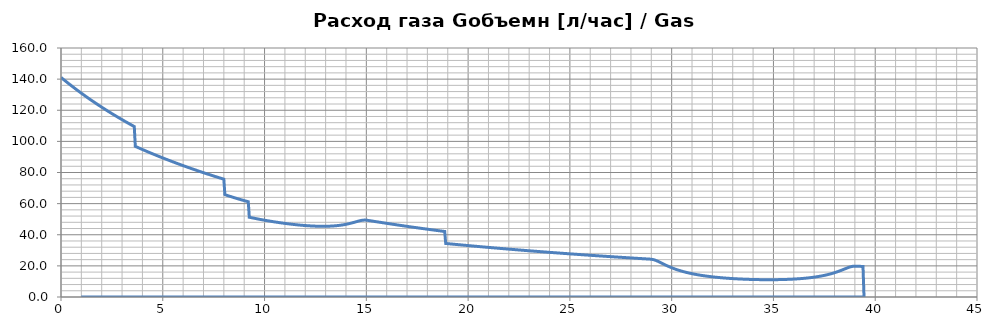
| Category | Расход газа Gобъемн [л/час] / Gas consumption [l/s] |
|---|---|
| 0.0 | 141.093 |
| 0.05 | 140.556 |
| 0.1 | 140.022 |
| 0.15000000000000002 | 139.491 |
| 0.2 | 138.964 |
| 0.25 | 138.441 |
| 0.3 | 137.92 |
| 0.35 | 137.403 |
| 0.39999999999999997 | 136.889 |
| 0.44999999999999996 | 136.378 |
| 0.49999999999999994 | 135.87 |
| 0.5499999999999999 | 135.366 |
| 0.6 | 134.864 |
| 0.65 | 134.366 |
| 0.7000000000000001 | 133.871 |
| 0.7500000000000001 | 133.378 |
| 0.8000000000000002 | 132.889 |
| 0.8500000000000002 | 132.403 |
| 0.9000000000000002 | 131.919 |
| 0.9500000000000003 | 131.439 |
| 1.0000000000000002 | 130.961 |
| 1.0500000000000003 | 130.486 |
| 1.1000000000000003 | 130.014 |
| 1.1500000000000004 | 129.545 |
| 1.2000000000000004 | 129.078 |
| 1.2500000000000004 | 128.615 |
| 1.3000000000000005 | 128.154 |
| 1.3500000000000005 | 127.695 |
| 1.4000000000000006 | 127.24 |
| 1.4500000000000006 | 126.787 |
| 1.5000000000000007 | 126.337 |
| 1.5500000000000007 | 125.889 |
| 1.6000000000000008 | 125.444 |
| 1.6500000000000008 | 125.001 |
| 1.7000000000000008 | 124.561 |
| 1.7500000000000009 | 124.124 |
| 1.800000000000001 | 123.689 |
| 1.850000000000001 | 123.257 |
| 1.900000000000001 | 122.827 |
| 1.950000000000001 | 122.399 |
| 2.000000000000001 | 121.973 |
| 2.0500000000000007 | 121.551 |
| 2.1000000000000005 | 121.13 |
| 2.1500000000000004 | 120.712 |
| 2.2 | 120.297 |
| 2.25 | 119.883 |
| 2.3 | 119.472 |
| 2.3499999999999996 | 119.063 |
| 2.3999999999999995 | 118.657 |
| 2.4499999999999993 | 118.253 |
| 2.499999999999999 | 117.851 |
| 2.549999999999999 | 117.451 |
| 2.5999999999999988 | 117.053 |
| 2.6499999999999986 | 116.658 |
| 2.6999999999999984 | 116.264 |
| 2.7499999999999982 | 115.873 |
| 2.799999999999998 | 115.484 |
| 2.849999999999998 | 115.097 |
| 2.8999999999999977 | 114.712 |
| 2.9499999999999975 | 114.33 |
| 2.9999999999999973 | 113.949 |
| 3.049999999999997 | 113.571 |
| 3.099999999999997 | 113.194 |
| 3.149999999999997 | 112.819 |
| 3.1999999999999966 | 112.447 |
| 3.2499999999999964 | 112.076 |
| 3.2999999999999963 | 111.707 |
| 3.349999999999996 | 111.34 |
| 3.399999999999996 | 110.976 |
| 3.4499999999999957 | 110.613 |
| 3.4999999999999956 | 110.252 |
| 3.5499999999999954 | 109.892 |
| 3.599999999999995 | 109.535 |
| 3.649999999999995 | 96.794 |
| 3.699999999999995 | 96.502 |
| 3.7499999999999947 | 96.211 |
| 3.7999999999999945 | 95.921 |
| 3.8499999999999943 | 95.633 |
| 3.899999999999994 | 95.347 |
| 3.949999999999994 | 95.061 |
| 3.999999999999994 | 94.777 |
| 4.049999999999994 | 94.494 |
| 4.099999999999993 | 94.213 |
| 4.149999999999993 | 93.933 |
| 4.199999999999993 | 93.654 |
| 4.249999999999993 | 93.377 |
| 4.299999999999993 | 93.1 |
| 4.3499999999999925 | 92.826 |
| 4.399999999999992 | 92.552 |
| 4.449999999999992 | 92.279 |
| 4.499999999999992 | 92.008 |
| 4.549999999999992 | 91.738 |
| 4.599999999999992 | 91.47 |
| 4.6499999999999915 | 91.202 |
| 4.699999999999991 | 90.936 |
| 4.749999999999991 | 90.671 |
| 4.799999999999991 | 90.407 |
| 4.849999999999991 | 90.145 |
| 4.899999999999991 | 89.883 |
| 4.94999999999999 | 89.623 |
| 4.99999999999999 | 89.364 |
| 5.04999999999999 | 89.106 |
| 5.09999999999999 | 88.849 |
| 5.14999999999999 | 88.593 |
| 5.1999999999999895 | 88.339 |
| 5.249999999999989 | 88.085 |
| 5.299999999999989 | 87.833 |
| 5.349999999999989 | 87.582 |
| 5.399999999999989 | 87.332 |
| 5.449999999999989 | 87.083 |
| 5.4999999999999885 | 86.835 |
| 5.549999999999988 | 86.589 |
| 5.599999999999988 | 86.343 |
| 5.649999999999988 | 86.099 |
| 5.699999999999988 | 85.855 |
| 5.749999999999988 | 85.613 |
| 5.799999999999987 | 85.371 |
| 5.849999999999987 | 85.131 |
| 5.899999999999987 | 84.892 |
| 5.949999999999987 | 84.653 |
| 5.999999999999987 | 84.416 |
| 6.0499999999999865 | 84.18 |
| 6.099999999999986 | 83.945 |
| 6.149999999999986 | 83.711 |
| 6.199999999999986 | 83.478 |
| 6.249999999999986 | 83.245 |
| 6.299999999999986 | 83.014 |
| 6.349999999999985 | 82.784 |
| 6.399999999999985 | 82.555 |
| 6.449999999999985 | 82.327 |
| 6.499999999999985 | 82.099 |
| 6.549999999999985 | 81.873 |
| 6.5999999999999845 | 81.648 |
| 6.649999999999984 | 81.423 |
| 6.699999999999984 | 81.2 |
| 6.749999999999984 | 80.977 |
| 6.799999999999984 | 80.756 |
| 6.849999999999984 | 80.535 |
| 6.8999999999999835 | 80.316 |
| 6.949999999999983 | 80.097 |
| 6.999999999999983 | 79.879 |
| 7.049999999999983 | 79.662 |
| 7.099999999999983 | 79.446 |
| 7.149999999999983 | 79.231 |
| 7.199999999999982 | 79.016 |
| 7.249999999999982 | 78.803 |
| 7.299999999999982 | 78.59 |
| 7.349999999999982 | 78.379 |
| 7.399999999999982 | 78.168 |
| 7.4499999999999815 | 77.958 |
| 7.499999999999981 | 77.749 |
| 7.549999999999981 | 77.541 |
| 7.599999999999981 | 77.333 |
| 7.649999999999981 | 77.127 |
| 7.699999999999981 | 76.921 |
| 7.7499999999999805 | 76.716 |
| 7.79999999999998 | 76.512 |
| 7.84999999999998 | 76.309 |
| 7.89999999999998 | 76.107 |
| 7.94999999999998 | 75.905 |
| 7.99999999999998 | 75.705 |
| 8.04999999999998 | 65.791 |
| 8.09999999999998 | 65.566 |
| 8.14999999999998 | 65.344 |
| 8.199999999999982 | 65.125 |
| 8.249999999999982 | 64.908 |
| 8.299999999999983 | 64.694 |
| 8.349999999999984 | 64.482 |
| 8.399999999999984 | 64.272 |
| 8.449999999999985 | 64.065 |
| 8.499999999999986 | 63.861 |
| 8.549999999999986 | 63.658 |
| 8.599999999999987 | 63.458 |
| 8.649999999999988 | 63.26 |
| 8.699999999999989 | 63.064 |
| 8.74999999999999 | 62.87 |
| 8.79999999999999 | 62.679 |
| 8.84999999999999 | 62.489 |
| 8.899999999999991 | 62.302 |
| 8.949999999999992 | 62.116 |
| 8.999999999999993 | 61.932 |
| 9.049999999999994 | 61.75 |
| 9.099999999999994 | 61.571 |
| 9.149999999999995 | 61.393 |
| 9.199999999999996 | 61.216 |
| 9.249999999999996 | 51.247 |
| 9.299999999999997 | 51.108 |
| 9.349999999999998 | 50.972 |
| 9.399999999999999 | 50.837 |
| 9.45 | 50.704 |
| 9.5 | 50.572 |
| 9.55 | 50.441 |
| 9.600000000000001 | 50.313 |
| 9.650000000000002 | 50.185 |
| 9.700000000000003 | 50.06 |
| 9.750000000000004 | 49.935 |
| 9.800000000000004 | 49.813 |
| 9.850000000000005 | 49.691 |
| 9.900000000000006 | 49.571 |
| 9.950000000000006 | 49.453 |
| 10.000000000000007 | 49.336 |
| 10.050000000000008 | 49.221 |
| 10.100000000000009 | 49.107 |
| 10.15000000000001 | 48.994 |
| 10.20000000000001 | 48.883 |
| 10.25000000000001 | 48.773 |
| 10.300000000000011 | 48.665 |
| 10.350000000000012 | 48.558 |
| 10.400000000000013 | 48.453 |
| 10.450000000000014 | 48.349 |
| 10.500000000000014 | 48.246 |
| 10.550000000000015 | 48.145 |
| 10.600000000000016 | 48.046 |
| 10.650000000000016 | 47.948 |
| 10.700000000000017 | 47.851 |
| 10.750000000000018 | 47.756 |
| 10.800000000000018 | 47.662 |
| 10.85000000000002 | 47.57 |
| 10.90000000000002 | 47.479 |
| 10.95000000000002 | 47.39 |
| 11.000000000000021 | 47.303 |
| 11.050000000000022 | 47.217 |
| 11.100000000000023 | 47.133 |
| 11.150000000000023 | 47.05 |
| 11.200000000000024 | 46.969 |
| 11.250000000000025 | 46.889 |
| 11.300000000000026 | 46.811 |
| 11.350000000000026 | 46.735 |
| 11.400000000000027 | 46.661 |
| 11.450000000000028 | 46.588 |
| 11.500000000000028 | 46.517 |
| 11.55000000000003 | 46.448 |
| 11.60000000000003 | 46.38 |
| 11.65000000000003 | 46.315 |
| 11.700000000000031 | 46.251 |
| 11.750000000000032 | 46.19 |
| 11.800000000000033 | 46.13 |
| 11.850000000000033 | 46.073 |
| 11.900000000000034 | 46.017 |
| 11.950000000000035 | 45.964 |
| 12.000000000000036 | 45.913 |
| 12.050000000000036 | 45.864 |
| 12.100000000000037 | 45.817 |
| 12.150000000000038 | 45.773 |
| 12.200000000000038 | 45.731 |
| 12.250000000000039 | 45.691 |
| 12.30000000000004 | 45.654 |
| 12.35000000000004 | 45.62 |
| 12.400000000000041 | 45.588 |
| 12.450000000000042 | 45.559 |
| 12.500000000000043 | 45.533 |
| 12.550000000000043 | 45.51 |
| 12.600000000000044 | 45.49 |
| 12.650000000000045 | 45.473 |
| 12.700000000000045 | 45.459 |
| 12.750000000000046 | 45.449 |
| 12.800000000000047 | 45.442 |
| 12.850000000000048 | 45.438 |
| 12.900000000000048 | 45.439 |
| 12.950000000000049 | 45.443 |
| 13.00000000000005 | 45.451 |
| 13.05000000000005 | 45.463 |
| 13.100000000000051 | 45.479 |
| 13.150000000000052 | 45.5 |
| 13.200000000000053 | 45.526 |
| 13.250000000000053 | 45.556 |
| 13.300000000000054 | 45.591 |
| 13.350000000000055 | 45.631 |
| 13.400000000000055 | 45.676 |
| 13.450000000000056 | 45.727 |
| 13.500000000000057 | 45.784 |
| 13.550000000000058 | 45.847 |
| 13.600000000000058 | 45.915 |
| 13.650000000000059 | 45.991 |
| 13.70000000000006 | 46.072 |
| 13.75000000000006 | 46.161 |
| 13.800000000000061 | 46.256 |
| 13.850000000000062 | 46.359 |
| 13.900000000000063 | 46.469 |
| 13.950000000000063 | 46.587 |
| 14.000000000000064 | 46.712 |
| 14.050000000000065 | 46.845 |
| 14.100000000000065 | 46.986 |
| 14.150000000000066 | 47.134 |
| 14.200000000000067 | 47.29 |
| 14.250000000000068 | 47.453 |
| 14.300000000000068 | 47.623 |
| 14.350000000000069 | 47.799 |
| 14.40000000000007 | 47.979 |
| 14.45000000000007 | 48.163 |
| 14.500000000000071 | 48.349 |
| 14.550000000000072 | 48.534 |
| 14.600000000000072 | 48.714 |
| 14.650000000000073 | 48.886 |
| 14.700000000000074 | 49.045 |
| 14.750000000000075 | 49.185 |
| 14.800000000000075 | 49.299 |
| 14.850000000000076 | 49.379 |
| 14.900000000000077 | 49.42 |
| 14.950000000000077 | 49.416 |
| 15.000000000000078 | 49.369 |
| 15.050000000000079 | 49.288 |
| 15.10000000000008 | 49.189 |
| 15.15000000000008 | 49.083 |
| 15.200000000000081 | 48.978 |
| 15.250000000000082 | 48.873 |
| 15.300000000000082 | 48.769 |
| 15.350000000000083 | 48.665 |
| 15.400000000000084 | 48.561 |
| 15.450000000000085 | 48.457 |
| 15.500000000000085 | 48.354 |
| 15.550000000000086 | 48.251 |
| 15.600000000000087 | 48.148 |
| 15.650000000000087 | 48.046 |
| 15.700000000000088 | 47.944 |
| 15.750000000000089 | 47.842 |
| 15.80000000000009 | 47.741 |
| 15.85000000000009 | 47.64 |
| 15.900000000000091 | 47.539 |
| 15.950000000000092 | 47.439 |
| 16.000000000000092 | 47.338 |
| 16.050000000000093 | 47.239 |
| 16.100000000000094 | 47.139 |
| 16.150000000000095 | 47.04 |
| 16.200000000000095 | 46.941 |
| 16.250000000000096 | 46.842 |
| 16.300000000000097 | 46.744 |
| 16.350000000000097 | 46.646 |
| 16.400000000000098 | 46.548 |
| 16.4500000000001 | 46.451 |
| 16.5000000000001 | 46.354 |
| 16.5500000000001 | 46.257 |
| 16.6000000000001 | 46.16 |
| 16.6500000000001 | 46.064 |
| 16.700000000000102 | 45.968 |
| 16.750000000000103 | 45.872 |
| 16.800000000000104 | 45.777 |
| 16.850000000000104 | 45.682 |
| 16.900000000000105 | 45.587 |
| 16.950000000000106 | 45.492 |
| 17.000000000000107 | 45.398 |
| 17.050000000000107 | 45.304 |
| 17.100000000000108 | 45.21 |
| 17.15000000000011 | 45.117 |
| 17.20000000000011 | 45.024 |
| 17.25000000000011 | 44.931 |
| 17.30000000000011 | 44.838 |
| 17.35000000000011 | 44.746 |
| 17.400000000000112 | 44.654 |
| 17.450000000000113 | 44.562 |
| 17.500000000000114 | 44.47 |
| 17.550000000000114 | 44.379 |
| 17.600000000000115 | 44.288 |
| 17.650000000000116 | 44.197 |
| 17.700000000000117 | 44.107 |
| 17.750000000000117 | 44.017 |
| 17.800000000000118 | 43.927 |
| 17.85000000000012 | 43.837 |
| 17.90000000000012 | 43.748 |
| 17.95000000000012 | 43.659 |
| 18.00000000000012 | 43.57 |
| 18.05000000000012 | 43.481 |
| 18.100000000000122 | 43.393 |
| 18.150000000000123 | 43.305 |
| 18.200000000000124 | 43.217 |
| 18.250000000000124 | 43.129 |
| 18.300000000000125 | 43.042 |
| 18.350000000000126 | 42.955 |
| 18.400000000000126 | 42.868 |
| 18.450000000000127 | 42.781 |
| 18.500000000000128 | 42.695 |
| 18.55000000000013 | 42.609 |
| 18.60000000000013 | 42.523 |
| 18.65000000000013 | 42.438 |
| 18.70000000000013 | 42.352 |
| 18.75000000000013 | 42.267 |
| 18.800000000000132 | 42.182 |
| 18.850000000000133 | 42.098 |
| 18.900000000000134 | 34.403 |
| 18.950000000000134 | 34.34 |
| 19.000000000000135 | 34.277 |
| 19.050000000000136 | 34.213 |
| 19.100000000000136 | 34.151 |
| 19.150000000000137 | 34.088 |
| 19.200000000000138 | 34.025 |
| 19.25000000000014 | 33.963 |
| 19.30000000000014 | 33.9 |
| 19.35000000000014 | 33.838 |
| 19.40000000000014 | 33.776 |
| 19.45000000000014 | 33.715 |
| 19.500000000000142 | 33.653 |
| 19.550000000000143 | 33.591 |
| 19.600000000000144 | 33.53 |
| 19.650000000000144 | 33.469 |
| 19.700000000000145 | 33.408 |
| 19.750000000000146 | 33.347 |
| 19.800000000000146 | 33.286 |
| 19.850000000000147 | 33.226 |
| 19.900000000000148 | 33.165 |
| 19.95000000000015 | 33.105 |
| 20.00000000000015 | 33.045 |
| 20.05000000000015 | 32.985 |
| 20.10000000000015 | 32.925 |
| 20.15000000000015 | 32.866 |
| 20.200000000000152 | 32.806 |
| 20.250000000000153 | 32.747 |
| 20.300000000000153 | 32.688 |
| 20.350000000000154 | 32.629 |
| 20.400000000000155 | 32.57 |
| 20.450000000000156 | 32.511 |
| 20.500000000000156 | 32.452 |
| 20.550000000000157 | 32.394 |
| 20.600000000000158 | 32.336 |
| 20.65000000000016 | 32.278 |
| 20.70000000000016 | 32.22 |
| 20.75000000000016 | 32.162 |
| 20.80000000000016 | 32.104 |
| 20.85000000000016 | 32.046 |
| 20.900000000000162 | 31.989 |
| 20.950000000000163 | 31.932 |
| 21.000000000000163 | 31.875 |
| 21.050000000000164 | 31.818 |
| 21.100000000000165 | 31.761 |
| 21.150000000000166 | 31.704 |
| 21.200000000000166 | 31.647 |
| 21.250000000000167 | 31.591 |
| 21.300000000000168 | 31.535 |
| 21.35000000000017 | 31.479 |
| 21.40000000000017 | 31.423 |
| 21.45000000000017 | 31.367 |
| 21.50000000000017 | 31.311 |
| 21.55000000000017 | 31.255 |
| 21.600000000000172 | 31.2 |
| 21.650000000000173 | 31.145 |
| 21.700000000000173 | 31.089 |
| 21.750000000000174 | 31.034 |
| 21.800000000000175 | 30.979 |
| 21.850000000000176 | 30.925 |
| 21.900000000000176 | 30.87 |
| 21.950000000000177 | 30.815 |
| 22.000000000000178 | 30.761 |
| 22.05000000000018 | 30.707 |
| 22.10000000000018 | 30.653 |
| 22.15000000000018 | 30.599 |
| 22.20000000000018 | 30.545 |
| 22.25000000000018 | 30.491 |
| 22.300000000000182 | 30.438 |
| 22.350000000000183 | 30.384 |
| 22.400000000000183 | 30.331 |
| 22.450000000000184 | 30.278 |
| 22.500000000000185 | 30.225 |
| 22.550000000000185 | 30.172 |
| 22.600000000000186 | 30.119 |
| 22.650000000000187 | 30.066 |
| 22.700000000000188 | 30.014 |
| 22.75000000000019 | 29.961 |
| 22.80000000000019 | 29.909 |
| 22.85000000000019 | 29.857 |
| 22.90000000000019 | 29.805 |
| 22.95000000000019 | 29.753 |
| 23.000000000000192 | 29.701 |
| 23.050000000000193 | 29.649 |
| 23.100000000000193 | 29.598 |
| 23.150000000000194 | 29.546 |
| 23.200000000000195 | 29.495 |
| 23.250000000000195 | 29.444 |
| 23.300000000000196 | 29.393 |
| 23.350000000000197 | 29.342 |
| 23.400000000000198 | 29.291 |
| 23.4500000000002 | 29.24 |
| 23.5000000000002 | 29.19 |
| 23.5500000000002 | 29.139 |
| 23.6000000000002 | 29.089 |
| 23.6500000000002 | 29.039 |
| 23.700000000000202 | 28.989 |
| 23.750000000000203 | 28.939 |
| 23.800000000000203 | 28.889 |
| 23.850000000000204 | 28.839 |
| 23.900000000000205 | 28.79 |
| 23.950000000000205 | 28.74 |
| 24.000000000000206 | 28.691 |
| 24.050000000000207 | 28.642 |
| 24.100000000000207 | 28.593 |
| 24.150000000000208 | 28.544 |
| 24.20000000000021 | 28.495 |
| 24.25000000000021 | 28.446 |
| 24.30000000000021 | 28.397 |
| 24.35000000000021 | 28.349 |
| 24.40000000000021 | 28.3 |
| 24.450000000000212 | 28.252 |
| 24.500000000000213 | 28.204 |
| 24.550000000000214 | 28.156 |
| 24.600000000000215 | 28.108 |
| 24.650000000000215 | 28.06 |
| 24.700000000000216 | 28.012 |
| 24.750000000000217 | 27.964 |
| 24.800000000000217 | 27.917 |
| 24.850000000000218 | 27.869 |
| 24.90000000000022 | 27.822 |
| 24.95000000000022 | 27.775 |
| 25.00000000000022 | 27.728 |
| 25.05000000000022 | 27.681 |
| 25.10000000000022 | 27.634 |
| 25.150000000000222 | 27.587 |
| 25.200000000000223 | 27.541 |
| 25.250000000000224 | 27.494 |
| 25.300000000000225 | 27.448 |
| 25.350000000000225 | 27.401 |
| 25.400000000000226 | 27.355 |
| 25.450000000000227 | 27.309 |
| 25.500000000000227 | 27.263 |
| 25.550000000000228 | 27.217 |
| 25.60000000000023 | 27.171 |
| 25.65000000000023 | 27.126 |
| 25.70000000000023 | 27.08 |
| 25.75000000000023 | 27.035 |
| 25.80000000000023 | 26.989 |
| 25.850000000000232 | 26.944 |
| 25.900000000000233 | 26.899 |
| 25.950000000000234 | 26.854 |
| 26.000000000000234 | 26.809 |
| 26.050000000000235 | 26.764 |
| 26.100000000000236 | 26.719 |
| 26.150000000000237 | 26.675 |
| 26.200000000000237 | 26.63 |
| 26.250000000000238 | 26.586 |
| 26.30000000000024 | 26.541 |
| 26.35000000000024 | 26.497 |
| 26.40000000000024 | 26.453 |
| 26.45000000000024 | 26.409 |
| 26.50000000000024 | 26.365 |
| 26.550000000000242 | 26.321 |
| 26.600000000000243 | 26.277 |
| 26.650000000000244 | 26.234 |
| 26.700000000000244 | 26.19 |
| 26.750000000000245 | 26.147 |
| 26.800000000000246 | 26.103 |
| 26.850000000000247 | 26.06 |
| 26.900000000000247 | 26.017 |
| 26.950000000000248 | 25.974 |
| 27.00000000000025 | 25.931 |
| 27.05000000000025 | 25.888 |
| 27.10000000000025 | 25.846 |
| 27.15000000000025 | 25.803 |
| 27.20000000000025 | 25.76 |
| 27.250000000000252 | 25.718 |
| 27.300000000000253 | 25.676 |
| 27.350000000000254 | 25.633 |
| 27.400000000000254 | 25.591 |
| 27.450000000000255 | 25.549 |
| 27.500000000000256 | 25.507 |
| 27.550000000000257 | 25.465 |
| 27.600000000000257 | 25.423 |
| 27.650000000000258 | 25.382 |
| 27.70000000000026 | 25.34 |
| 27.75000000000026 | 25.299 |
| 27.80000000000026 | 25.257 |
| 27.85000000000026 | 25.216 |
| 27.90000000000026 | 25.175 |
| 27.950000000000262 | 25.134 |
| 28.000000000000263 | 25.093 |
| 28.050000000000264 | 25.052 |
| 28.100000000000264 | 25.011 |
| 28.150000000000265 | 24.97 |
| 28.200000000000266 | 24.929 |
| 28.250000000000266 | 24.889 |
| 28.300000000000267 | 24.848 |
| 28.350000000000268 | 24.808 |
| 28.40000000000027 | 24.768 |
| 28.45000000000027 | 24.727 |
| 28.50000000000027 | 24.687 |
| 28.55000000000027 | 24.647 |
| 28.60000000000027 | 24.607 |
| 28.650000000000272 | 24.567 |
| 28.700000000000273 | 24.528 |
| 28.750000000000274 | 24.488 |
| 28.800000000000274 | 24.448 |
| 28.850000000000275 | 24.409 |
| 28.900000000000276 | 24.369 |
| 28.950000000000276 | 24.324 |
| 29.000000000000277 | 24.259 |
| 29.050000000000278 | 24.16 |
| 29.10000000000028 | 24.019 |
| 29.15000000000028 | 23.833 |
| 29.20000000000028 | 23.608 |
| 29.25000000000028 | 23.35 |
| 29.30000000000028 | 23.067 |
| 29.350000000000282 | 22.765 |
| 29.400000000000283 | 22.45 |
| 29.450000000000284 | 22.129 |
| 29.500000000000284 | 21.804 |
| 29.550000000000285 | 21.479 |
| 29.600000000000286 | 21.156 |
| 29.650000000000286 | 20.837 |
| 29.700000000000287 | 20.524 |
| 29.750000000000288 | 20.218 |
| 29.80000000000029 | 19.92 |
| 29.85000000000029 | 19.629 |
| 29.90000000000029 | 19.346 |
| 29.95000000000029 | 19.072 |
| 30.00000000000029 | 18.806 |
| 30.050000000000292 | 18.549 |
| 30.100000000000293 | 18.3 |
| 30.150000000000293 | 18.059 |
| 30.200000000000294 | 17.826 |
| 30.250000000000295 | 17.6 |
| 30.300000000000296 | 17.382 |
| 30.350000000000296 | 17.172 |
| 30.400000000000297 | 16.968 |
| 30.450000000000298 | 16.771 |
| 30.5000000000003 | 16.581 |
| 30.5500000000003 | 16.396 |
| 30.6000000000003 | 16.218 |
| 30.6500000000003 | 16.046 |
| 30.7000000000003 | 15.879 |
| 30.750000000000302 | 15.718 |
| 30.800000000000303 | 15.562 |
| 30.850000000000303 | 15.411 |
| 30.900000000000304 | 15.264 |
| 30.950000000000305 | 15.122 |
| 31.000000000000306 | 14.985 |
| 31.050000000000306 | 14.852 |
| 31.100000000000307 | 14.723 |
| 31.150000000000308 | 14.598 |
| 31.20000000000031 | 14.476 |
| 31.25000000000031 | 14.359 |
| 31.30000000000031 | 14.244 |
| 31.35000000000031 | 14.134 |
| 31.40000000000031 | 14.026 |
| 31.450000000000312 | 13.922 |
| 31.500000000000313 | 13.821 |
| 31.550000000000313 | 13.723 |
| 31.600000000000314 | 13.627 |
| 31.650000000000315 | 13.534 |
| 31.700000000000315 | 13.444 |
| 31.750000000000316 | 13.357 |
| 31.800000000000317 | 13.272 |
| 31.850000000000318 | 13.19 |
| 31.90000000000032 | 13.11 |
| 31.95000000000032 | 13.032 |
| 32.00000000000032 | 12.956 |
| 32.05000000000032 | 12.883 |
| 32.100000000000314 | 12.811 |
| 32.15000000000031 | 12.742 |
| 32.20000000000031 | 12.674 |
| 32.250000000000306 | 12.609 |
| 32.3000000000003 | 12.545 |
| 32.3500000000003 | 12.483 |
| 32.4000000000003 | 12.423 |
| 32.450000000000294 | 12.365 |
| 32.50000000000029 | 12.308 |
| 32.55000000000029 | 12.253 |
| 32.600000000000286 | 12.2 |
| 32.65000000000028 | 12.148 |
| 32.70000000000028 | 12.097 |
| 32.75000000000028 | 12.048 |
| 32.800000000000274 | 12.001 |
| 32.85000000000027 | 11.955 |
| 32.90000000000027 | 11.911 |
| 32.950000000000266 | 11.867 |
| 33.00000000000026 | 11.826 |
| 33.05000000000026 | 11.785 |
| 33.10000000000026 | 11.746 |
| 33.150000000000254 | 11.708 |
| 33.20000000000025 | 11.672 |
| 33.25000000000025 | 11.636 |
| 33.300000000000246 | 11.602 |
| 33.35000000000024 | 11.569 |
| 33.40000000000024 | 11.538 |
| 33.45000000000024 | 11.507 |
| 33.500000000000234 | 11.478 |
| 33.55000000000023 | 11.45 |
| 33.60000000000023 | 11.423 |
| 33.650000000000226 | 11.397 |
| 33.70000000000022 | 11.372 |
| 33.75000000000022 | 11.349 |
| 33.80000000000022 | 11.326 |
| 33.850000000000215 | 11.305 |
| 33.90000000000021 | 11.285 |
| 33.95000000000021 | 11.266 |
| 34.000000000000206 | 11.248 |
| 34.0500000000002 | 11.231 |
| 34.1000000000002 | 11.215 |
| 34.1500000000002 | 11.2 |
| 34.200000000000195 | 11.186 |
| 34.25000000000019 | 11.174 |
| 34.30000000000019 | 11.162 |
| 34.350000000000186 | 11.152 |
| 34.40000000000018 | 11.143 |
| 34.45000000000018 | 11.135 |
| 34.50000000000018 | 11.128 |
| 34.550000000000175 | 11.122 |
| 34.60000000000017 | 11.117 |
| 34.65000000000017 | 11.114 |
| 34.700000000000166 | 11.111 |
| 34.75000000000016 | 11.11 |
| 34.80000000000016 | 11.11 |
| 34.85000000000016 | 11.111 |
| 34.900000000000155 | 11.114 |
| 34.95000000000015 | 11.117 |
| 35.00000000000015 | 11.122 |
| 35.050000000000146 | 11.128 |
| 35.10000000000014 | 11.135 |
| 35.15000000000014 | 11.144 |
| 35.20000000000014 | 11.154 |
| 35.250000000000135 | 11.165 |
| 35.30000000000013 | 11.178 |
| 35.35000000000013 | 11.192 |
| 35.40000000000013 | 11.208 |
| 35.450000000000124 | 11.225 |
| 35.50000000000012 | 11.243 |
| 35.55000000000012 | 11.263 |
| 35.600000000000115 | 11.285 |
| 35.65000000000011 | 11.308 |
| 35.70000000000011 | 11.333 |
| 35.75000000000011 | 11.359 |
| 35.800000000000104 | 11.388 |
| 35.8500000000001 | 11.418 |
| 35.9000000000001 | 11.449 |
| 35.950000000000095 | 11.483 |
| 36.00000000000009 | 11.518 |
| 36.05000000000009 | 11.556 |
| 36.10000000000009 | 11.595 |
| 36.150000000000084 | 11.637 |
| 36.20000000000008 | 11.681 |
| 36.25000000000008 | 11.727 |
| 36.300000000000075 | 11.775 |
| 36.35000000000007 | 11.826 |
| 36.40000000000007 | 11.879 |
| 36.45000000000007 | 11.934 |
| 36.500000000000064 | 11.993 |
| 36.55000000000006 | 12.054 |
| 36.60000000000006 | 12.117 |
| 36.650000000000055 | 12.184 |
| 36.70000000000005 | 12.253 |
| 36.75000000000005 | 12.326 |
| 36.80000000000005 | 12.402 |
| 36.850000000000044 | 12.481 |
| 36.90000000000004 | 12.564 |
| 36.95000000000004 | 12.651 |
| 37.000000000000036 | 12.741 |
| 37.05000000000003 | 12.835 |
| 37.10000000000003 | 12.933 |
| 37.15000000000003 | 13.035 |
| 37.200000000000024 | 13.142 |
| 37.25000000000002 | 13.253 |
| 37.30000000000002 | 13.369 |
| 37.350000000000016 | 13.49 |
| 37.40000000000001 | 13.616 |
| 37.45000000000001 | 13.748 |
| 37.50000000000001 | 13.885 |
| 37.550000000000004 | 14.027 |
| 37.6 | 14.176 |
| 37.65 | 14.331 |
| 37.699999999999996 | 14.492 |
| 37.74999999999999 | 14.66 |
| 37.79999999999999 | 14.835 |
| 37.84999999999999 | 15.017 |
| 37.899999999999984 | 15.206 |
| 37.94999999999998 | 15.402 |
| 37.99999999999998 | 15.606 |
| 38.049999999999976 | 15.818 |
| 38.09999999999997 | 16.037 |
| 38.14999999999997 | 16.264 |
| 38.19999999999997 | 16.499 |
| 38.249999999999964 | 16.74 |
| 38.29999999999996 | 16.988 |
| 38.34999999999996 | 17.242 |
| 38.399999999999956 | 17.5 |
| 38.44999999999995 | 17.762 |
| 38.49999999999995 | 18.026 |
| 38.54999999999995 | 18.288 |
| 38.599999999999945 | 18.546 |
| 38.64999999999994 | 18.796 |
| 38.69999999999994 | 19.033 |
| 38.749999999999936 | 19.25 |
| 38.79999999999993 | 19.441 |
| 38.84999999999993 | 19.598 |
| 38.89999999999993 | 19.716 |
| 38.949999999999925 | 19.789 |
| 38.99999999999992 | 19.819 |
| 39.04999999999992 | 19.815 |
| 39.099999999999916 | 19.791 |
| 39.14999999999991 | 19.762 |
| 39.19999999999991 | 19.732 |
| 39.24999999999991 | 19.703 |
| 39.299999999999905 | 19.673 |
| 39.3499999999999 | 19.644 |
| 39.3999999999999 | 19.614 |
| 39.449999999999896 | 0 |
| 1.0 | 0 |
| 1.0 | 0 |
| 1.0 | 0 |
| 1.0 | 0 |
| 1.0 | 0 |
| 1.0 | 0 |
| 1.0 | 0 |
| 1.0 | 0 |
| 1.0 | 0 |
| 1.0 | 0 |
| 1.0 | 0 |
| 1.0 | 0 |
| 1.0 | 0 |
| 1.0 | 0 |
| 1.0 | 0 |
| 1.0 | 0 |
| 1.0 | 0 |
| 1.0 | 0 |
| 1.0 | 0 |
| 1.0 | 0 |
| 1.0 | 0 |
| 1.0 | 0 |
| 1.0 | 0 |
| 1.0 | 0 |
| 1.0 | 0 |
| 1.0 | 0 |
| 1.0 | 0 |
| 1.0 | 0 |
| 1.0 | 0 |
| 1.0 | 0 |
| 1.0 | 0 |
| 1.0 | 0 |
| 1.0 | 0 |
| 1.0 | 0 |
| 1.0 | 0 |
| 1.0 | 0 |
| 1.0 | 0 |
| 1.0 | 0 |
| 1.0 | 0 |
| 1.0 | 0 |
| 1.0 | 0 |
| 1.0 | 0 |
| 1.0 | 0 |
| 1.0 | 0 |
| 1.0 | 0 |
| 1.0 | 0 |
| 1.0 | 0 |
| 1.0 | 0 |
| 1.0 | 0 |
| 1.0 | 0 |
| 1.0 | 0 |
| 1.0 | 0 |
| 1.0 | 0 |
| 1.0 | 0 |
| 1.0 | 0 |
| 1.0 | 0 |
| 1.0 | 0 |
| 1.0 | 0 |
| 1.0 | 0 |
| 1.0 | 0 |
| 1.0 | 0 |
| 1.0 | 0 |
| 1.0 | 0 |
| 1.0 | 0 |
| 1.0 | 0 |
| 1.0 | 0 |
| 1.0 | 0 |
| 1.0 | 0 |
| 1.0 | 0 |
| 1.0 | 0 |
| 1.0 | 0 |
| 1.0 | 0 |
| 1.0 | 0 |
| 1.0 | 0 |
| 1.0 | 0 |
| 1.0 | 0 |
| 1.0 | 0 |
| 1.0 | 0 |
| 1.0 | 0 |
| 1.0 | 0 |
| 1.0 | 0 |
| 1.0 | 0 |
| 1.0 | 0 |
| 1.0 | 0 |
| 1.0 | 0 |
| 1.0 | 0 |
| 1.0 | 0 |
| 1.0 | 0 |
| 1.0 | 0 |
| 1.0 | 0 |
| 1.0 | 0 |
| 1.0 | 0 |
| 1.0 | 0 |
| 1.0 | 0 |
| 1.0 | 0 |
| 1.0 | 0 |
| 1.0 | 0 |
| 1.0 | 0 |
| 1.0 | 0 |
| 1.0 | 0 |
| 1.0 | 0 |
| 1.0 | 0 |
| 1.0 | 0 |
| 1.0 | 0 |
| 1.0 | 0 |
| 1.0 | 0 |
| 1.0 | 0 |
| 1.0 | 0 |
| 1.0 | 0 |
| 1.0 | 0 |
| 1.0 | 0 |
| 1.0 | 0 |
| 1.0 | 0 |
| 1.0 | 0 |
| 1.0 | 0 |
| 1.0 | 0 |
| 1.0 | 0 |
| 1.0 | 0 |
| 1.0 | 0 |
| 1.0 | 0 |
| 1.0 | 0 |
| 1.0 | 0 |
| 1.0 | 0 |
| 1.0 | 0 |
| 1.0 | 0 |
| 1.0 | 0 |
| 1.0 | 0 |
| 1.0 | 0 |
| 1.0 | 0 |
| 1.0 | 0 |
| 1.0 | 0 |
| 1.0 | 0 |
| 1.0 | 0 |
| 1.0 | 0 |
| 1.0 | 0 |
| 1.0 | 0 |
| 1.0 | 0 |
| 1.0 | 0 |
| 1.0 | 0 |
| 1.0 | 0 |
| 1.0 | 0 |
| 1.0 | 0 |
| 1.0 | 0 |
| 1.0 | 0 |
| 1.0 | 0 |
| 1.0 | 0 |
| 1.0 | 0 |
| 1.0 | 0 |
| 1.0 | 0 |
| 1.0 | 0 |
| 1.0 | 0 |
| 1.0 | 0 |
| 1.0 | 0 |
| 1.0 | 0 |
| 1.0 | 0 |
| 1.0 | 0 |
| 1.0 | 0 |
| 1.0 | 0 |
| 1.0 | 0 |
| 1.0 | 0 |
| 1.0 | 0 |
| 1.0 | 0 |
| 1.0 | 0 |
| 1.0 | 0 |
| 1.0 | 0 |
| 1.0 | 0 |
| 1.0 | 0 |
| 1.0 | 0 |
| 1.0 | 0 |
| 1.0 | 0 |
| 1.0 | 0 |
| 1.0 | 0 |
| 1.0 | 0 |
| 1.0 | 0 |
| 1.0 | 0 |
| 1.0 | 0 |
| 1.0 | 0 |
| 1.0 | 0 |
| 1.0 | 0 |
| 1.0 | 0 |
| 1.0 | 0 |
| 1.0 | 0 |
| 1.0 | 0 |
| 1.0 | 0 |
| 1.0 | 0 |
| 1.0 | 0 |
| 1.0 | 0 |
| 1.0 | 0 |
| 1.0 | 0 |
| 1.0 | 0 |
| 1.0 | 0 |
| 1.0 | 0 |
| 1.0 | 0 |
| 1.0 | 0 |
| 1.0 | 0 |
| 1.0 | 0 |
| 1.0 | 0 |
| 1.0 | 0 |
| 1.0 | 0 |
| 1.0 | 0 |
| 1.0 | 0 |
| 1.0 | 0 |
| 1.0 | 0 |
| 1.0 | 0 |
| 1.0 | 0 |
| 1.0 | 0 |
| 1.0 | 0 |
| 1.0 | 0 |
| 1.0 | 0 |
| 1.0 | 0 |
| 1.0 | 0 |
| 1.0 | 0 |
| 1.0 | 0 |
| 1.0 | 0 |
| 1.0 | 0 |
| 1.0 | 0 |
| 1.0 | 0 |
| 1.0 | 0 |
| 1.0 | 0 |
| 1.0 | 0 |
| 1.0 | 0 |
| 1.0 | 0 |
| 1.0 | 0 |
| 1.0 | 0 |
| 1.0 | 0 |
| 1.0 | 0 |
| 1.0 | 0 |
| 1.0 | 0 |
| 1.0 | 0 |
| 1.0 | 0 |
| 1.0 | 0 |
| 1.0 | 0 |
| 1.0 | 0 |
| 1.0 | 0 |
| 1.0 | 0 |
| 1.0 | 0 |
| 1.0 | 0 |
| 1.0 | 0 |
| 1.0 | 0 |
| 1.0 | 0 |
| 1.0 | 0 |
| 1.0 | 0 |
| 1.0 | 0 |
| 1.0 | 0 |
| 1.0 | 0 |
| 1.0 | 0 |
| 1.0 | 0 |
| 1.0 | 0 |
| 1.0 | 0 |
| 1.0 | 0 |
| 1.0 | 0 |
| 1.0 | 0 |
| 1.0 | 0 |
| 1.0 | 0 |
| 1.0 | 0 |
| 1.0 | 0 |
| 1.0 | 0 |
| 1.0 | 0 |
| 1.0 | 0 |
| 1.0 | 0 |
| 1.0 | 0 |
| 1.0 | 0 |
| 1.0 | 0 |
| 1.0 | 0 |
| 1.0 | 0 |
| 1.0 | 0 |
| 1.0 | 0 |
| 1.0 | 0 |
| 1.0 | 0 |
| 1.0 | 0 |
| 1.0 | 0 |
| 1.0 | 0 |
| 1.0 | 0 |
| 1.0 | 0 |
| 1.0 | 0 |
| 1.0 | 0 |
| 1.0 | 0 |
| 1.0 | 0 |
| 1.0 | 0 |
| 1.0 | 0 |
| 1.0 | 0 |
| 1.0 | 0 |
| 1.0 | 0 |
| 1.0 | 0 |
| 1.0 | 0 |
| 1.0 | 0 |
| 1.0 | 0 |
| 1.0 | 0 |
| 1.0 | 0 |
| 1.0 | 0 |
| 1.0 | 0 |
| 1.0 | 0 |
| 1.0 | 0 |
| 1.0 | 0 |
| 1.0 | 0 |
| 1.0 | 0 |
| 1.0 | 0 |
| 1.0 | 0 |
| 1.0 | 0 |
| 1.0 | 0 |
| 1.0 | 0 |
| 1.0 | 0 |
| 1.0 | 0 |
| 1.0 | 0 |
| 1.0 | 0 |
| 1.0 | 0 |
| 1.0 | 0 |
| 1.0 | 0 |
| 1.0 | 0 |
| 1.0 | 0 |
| 1.0 | 0 |
| 1.0 | 0 |
| 1.0 | 0 |
| 1.0 | 0 |
| 1.0 | 0 |
| 1.0 | 0 |
| 1.0 | 0 |
| 1.0 | 0 |
| 1.0 | 0 |
| 1.0 | 0 |
| 1.0 | 0 |
| 1.0 | 0 |
| 1.0 | 0 |
| 1.0 | 0 |
| 1.0 | 0 |
| 1.0 | 0 |
| 1.0 | 0 |
| 1.0 | 0 |
| 1.0 | 0 |
| 1.0 | 0 |
| 1.0 | 0 |
| 1.0 | 0 |
| 1.0 | 0 |
| 1.0 | 0 |
| 1.0 | 0 |
| 1.0 | 0 |
| 1.0 | 0 |
| 1.0 | 0 |
| 1.0 | 0 |
| 1.0 | 0 |
| 1.0 | 0 |
| 1.0 | 0 |
| 1.0 | 0 |
| 1.0 | 0 |
| 1.0 | 0 |
| 1.0 | 0 |
| 1.0 | 0 |
| 1.0 | 0 |
| 1.0 | 0 |
| 1.0 | 0 |
| 1.0 | 0 |
| 1.0 | 0 |
| 1.0 | 0 |
| 1.0 | 0 |
| 1.0 | 0 |
| 1.0 | 0 |
| 1.0 | 0 |
| 1.0 | 0 |
| 1.0 | 0 |
| 1.0 | 0 |
| 1.0 | 0 |
| 1.0 | 0 |
| 1.0 | 0 |
| 1.0 | 0 |
| 1.0 | 0 |
| 1.0 | 0 |
| 1.0 | 0 |
| 1.0 | 0 |
| 1.0 | 0 |
| 1.0 | 0 |
| 1.0 | 0 |
| 1.0 | 0 |
| 1.0 | 0 |
| 1.0 | 0 |
| 1.0 | 0 |
| 1.0 | 0 |
| 1.0 | 0 |
| 1.0 | 0 |
| 1.0 | 0 |
| 1.0 | 0 |
| 1.0 | 0 |
| 1.0 | 0 |
| 1.0 | 0 |
| 1.0 | 0 |
| 1.0 | 0 |
| 1.0 | 0 |
| 1.0 | 0 |
| 1.0 | 0 |
| 1.0 | 0 |
| 1.0 | 0 |
| 1.0 | 0 |
| 1.0 | 0 |
| 1.0 | 0 |
| 1.0 | 0 |
| 1.0 | 0 |
| 1.0 | 0 |
| 1.0 | 0 |
| 1.0 | 0 |
| 1.0 | 0 |
| 1.0 | 0 |
| 1.0 | 0 |
| 1.0 | 0 |
| 1.0 | 0 |
| 1.0 | 0 |
| 1.0 | 0 |
| 1.0 | 0 |
| 1.0 | 0 |
| 1.0 | 0 |
| 1.0 | 0 |
| 1.0 | 0 |
| 1.0 | 0 |
| 1.0 | 0 |
| 1.0 | 0 |
| 1.0 | 0 |
| 1.0 | 0 |
| 1.0 | 0 |
| 1.0 | 0 |
| 1.0 | 0 |
| 1.0 | 0 |
| 1.0 | 0 |
| 1.0 | 0 |
| 1.0 | 0 |
| 1.0 | 0 |
| 1.0 | 0 |
| 1.0 | 0 |
| 1.0 | 0 |
| 1.0 | 0 |
| 1.0 | 0 |
| 1.0 | 0 |
| 1.0 | 0 |
| 1.0 | 0 |
| 1.0 | 0 |
| 1.0 | 0 |
| 1.0 | 0 |
| 1.0 | 0 |
| 1.0 | 0 |
| 1.0 | 0 |
| 1.0 | 0 |
| 1.0 | 0 |
| 1.0 | 0 |
| 1.0 | 0 |
| 1.0 | 0 |
| 1.0 | 0 |
| 1.0 | 0 |
| 1.0 | 0 |
| 1.0 | 0 |
| 1.0 | 0 |
| 1.0 | 0 |
| 1.0 | 0 |
| 1.0 | 0 |
| 1.0 | 0 |
| 1.0 | 0 |
| 1.0 | 0 |
| 1.0 | 0 |
| 1.0 | 0 |
| 1.0 | 0 |
| 1.0 | 0 |
| 1.0 | 0 |
| 1.0 | 0 |
| 1.0 | 0 |
| 1.0 | 0 |
| 1.0 | 0 |
| 1.0 | 0 |
| 1.0 | 0 |
| 1.0 | 0 |
| 1.0 | 0 |
| 1.0 | 0 |
| 1.0 | 0 |
| 1.0 | 0 |
| 1.0 | 0 |
| 1.0 | 0 |
| 1.0 | 0 |
| 1.0 | 0 |
| 1.0 | 0 |
| 1.0 | 0 |
| 1.0 | 0 |
| 1.0 | 0 |
| 1.0 | 0 |
| 1.0 | 0 |
| 1.0 | 0 |
| 1.0 | 0 |
| 1.0 | 0 |
| 1.0 | 0 |
| 1.0 | 0 |
| 1.0 | 0 |
| 1.0 | 0 |
| 1.0 | 0 |
| 1.0 | 0 |
| 1.0 | 0 |
| 1.0 | 0 |
| 1.0 | 0 |
| 1.0 | 0 |
| 1.0 | 0 |
| 1.0 | 0 |
| 1.0 | 0 |
| 1.0 | 0 |
| 1.0 | 0 |
| 1.0 | 0 |
| 1.0 | 0 |
| 1.0 | 0 |
| 1.0 | 0 |
| 1.0 | 0 |
| 1.0 | 0 |
| 1.0 | 0 |
| 1.0 | 0 |
| 1.0 | 0 |
| 1.0 | 0 |
| 1.0 | 0 |
| 1.0 | 0 |
| 1.0 | 0 |
| 1.0 | 0 |